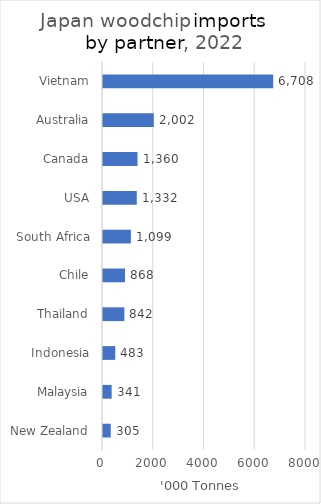
| Category | Series 0 |
|---|---|
| Vietnam | 6707769031 |
| Australia | 2002313000 |
| Canada | 1359784000 |
| USA | 1331675000 |
| South Africa | 1098870000 |
| Chile | 867895000 |
| Thailand | 841994000 |
| Indonesia | 483200000 |
| Malaysia | 341122000 |
| New Zealand | 305493000 |